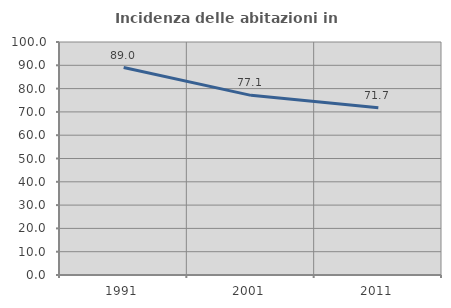
| Category | Incidenza delle abitazioni in proprietà  |
|---|---|
| 1991.0 | 89.039 |
| 2001.0 | 77.107 |
| 2011.0 | 71.732 |